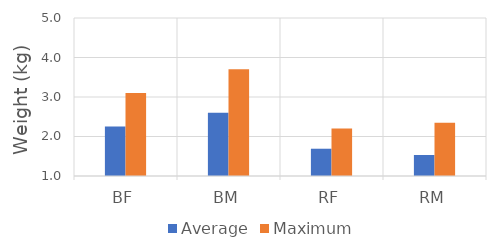
| Category | Average | Maximum |
|---|---|---|
| BF | 2.253 | 3.1 |
| BM | 2.604 | 3.7 |
| RF | 1.69 | 2.2 |
| RM | 1.532 | 2.35 |